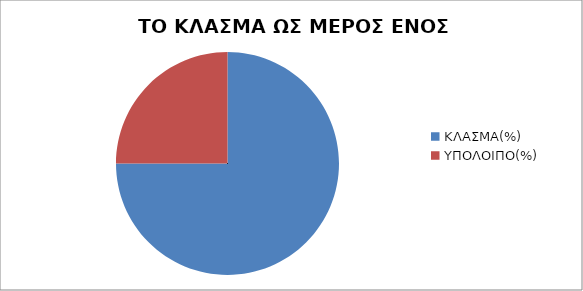
| Category | ΚΛΑΣΜΑ ΩΣ ΜΕΡΟΣ ΕΝΌΣ ΣΥΝΟΛΟΥ |
|---|---|
| ΚΛΑΣΜΑ(%) | 75 |
| ΥΠΟΛΟΙΠΟ(%) | 25 |